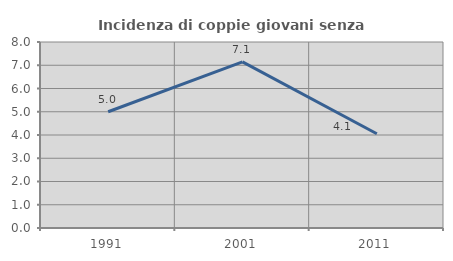
| Category | Incidenza di coppie giovani senza figli |
|---|---|
| 1991.0 | 5 |
| 2001.0 | 7.143 |
| 2011.0 | 4.054 |